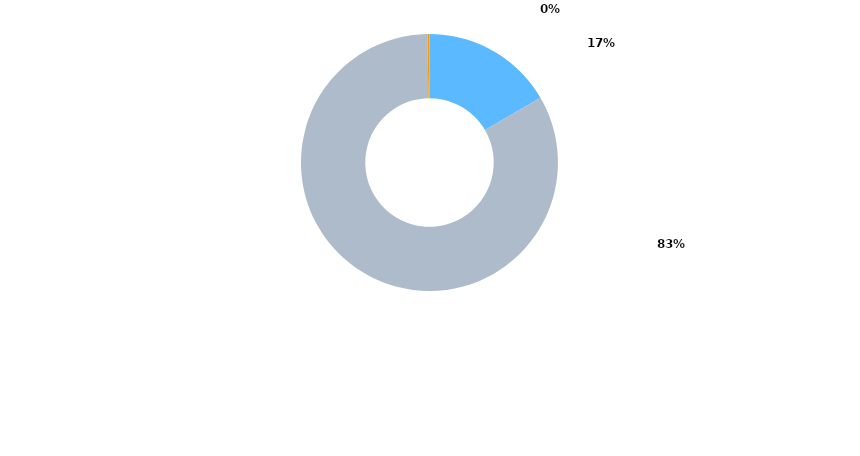
| Category | Series 0 |
|---|---|
| CONTRATOS MENORES | 163335.89 |
| ABIERTOS | 818981.57 |
| CENTRALIZADOS | 2586.4 |